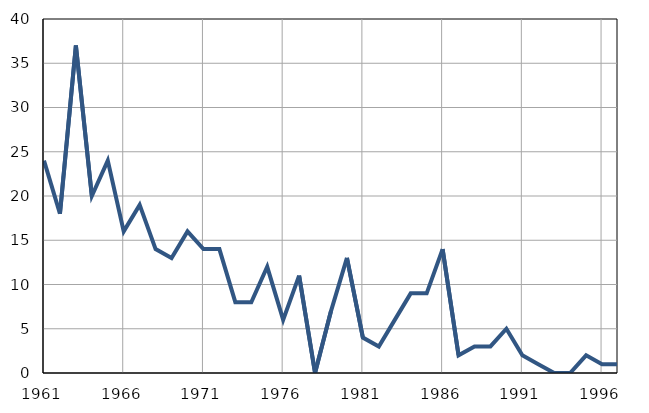
| Category | Infants
deaths |
|---|---|
| 1961.0 | 24 |
| 1962.0 | 18 |
| 1963.0 | 37 |
| 1964.0 | 20 |
| 1965.0 | 24 |
| 1966.0 | 16 |
| 1967.0 | 19 |
| 1968.0 | 14 |
| 1969.0 | 13 |
| 1970.0 | 16 |
| 1971.0 | 14 |
| 1972.0 | 14 |
| 1973.0 | 8 |
| 1974.0 | 8 |
| 1975.0 | 12 |
| 1976.0 | 6 |
| 1977.0 | 11 |
| 1978.0 | 0 |
| 1979.0 | 7 |
| 1980.0 | 13 |
| 1981.0 | 4 |
| 1982.0 | 3 |
| 1983.0 | 6 |
| 1984.0 | 9 |
| 1985.0 | 9 |
| 1986.0 | 14 |
| 1987.0 | 2 |
| 1988.0 | 3 |
| 1989.0 | 3 |
| 1990.0 | 5 |
| 1991.0 | 2 |
| 1992.0 | 1 |
| 1993.0 | 0 |
| 1994.0 | 0 |
| 1995.0 | 2 |
| 1996.0 | 1 |
| 1997.0 | 1 |